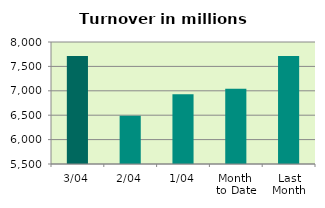
| Category | Series 0 |
|---|---|
| 3/04 | 7711.48 |
| 2/04 | 6488.18 |
| 1/04 | 6929.131 |
| Month 
to Date | 7042.93 |
| Last
Month | 7711.184 |